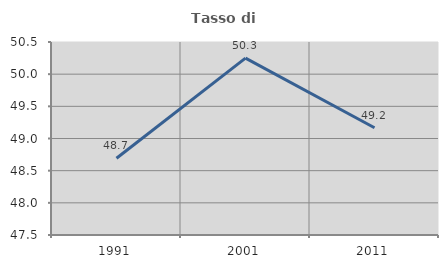
| Category | Tasso di occupazione   |
|---|---|
| 1991.0 | 48.694 |
| 2001.0 | 50.25 |
| 2011.0 | 49.167 |